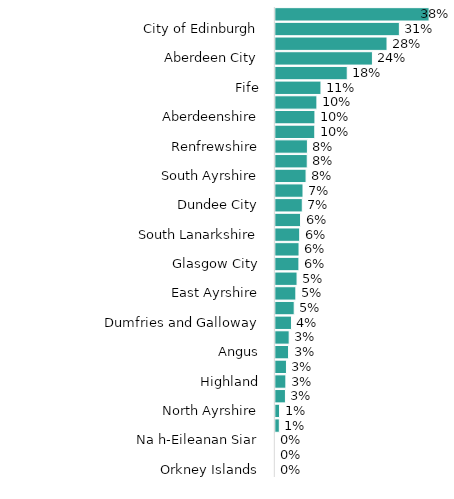
| Category | Percentage of population in decile 10 (least deprived) |
|---|---|
| Orkney Islands | 0 |
| Shetland Islands | 0 |
| Na h-Eileanan Siar | 0 |
| North Lanarkshire | 0.01 |
| North Ayrshire | 0.01 |
| Inverclyde | 0.025 |
| Highland | 0.026 |
| West Dunbartonshire | 0.028 |
| Angus | 0.033 |
| Scottish Borders | 0.034 |
| Dumfries and Galloway | 0.04 |
| Clackmannanshire | 0.047 |
| East Ayrshire | 0.051 |
| Midlothian | 0.054 |
| Glasgow City | 0.058 |
| Argyll and Bute | 0.059 |
| South Lanarkshire | 0.06 |
| Falkirk | 0.062 |
| Dundee City | 0.067 |
| Moray | 0.069 |
| South Ayrshire | 0.076 |
| Perth and Kinross | 0.079 |
| Renfrewshire | 0.079 |
| West Lothian | 0.098 |
| Aberdeenshire | 0.098 |
| East Lothian | 0.103 |
| Fife | 0.113 |
| Stirling | 0.178 |
| Aberdeen City | 0.24 |
| East Dunbartonshire | 0.276 |
| City of Edinburgh | 0.307 |
| East Renfrewshire | 0.381 |